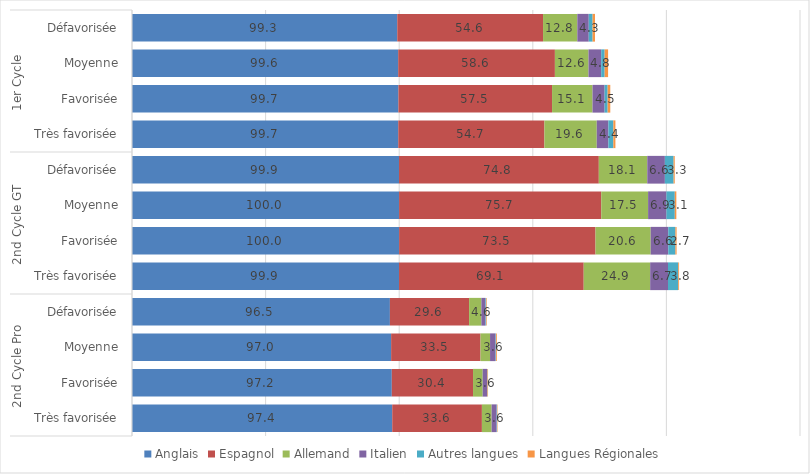
| Category | Anglais | Espagnol | Allemand | Italien | Autres langues | Langues Régionales |
|---|---|---|---|---|---|---|
| 0 | 99.273 | 54.563 | 12.825 | 4.279 | 1.441 | 0.892 |
| 1 | 99.625 | 58.649 | 12.568 | 4.756 | 1.298 | 1.283 |
| 2 | 99.703 | 57.501 | 15.146 | 4.529 | 1.132 | 0.99 |
| 3 | 99.65 | 54.69 | 19.596 | 4.354 | 1.85 | 0.778 |
| 4 | 99.934 | 74.775 | 18.129 | 6.593 | 3.264 | 0.424 |
| 5 | 99.954 | 75.666 | 17.533 | 6.854 | 3.137 | 0.579 |
| 6 | 99.966 | 73.503 | 20.64 | 6.591 | 2.67 | 0.44 |
| 7 | 99.936 | 69.119 | 24.868 | 6.67 | 3.83 | 0.322 |
| 8 | 96.522 | 29.636 | 4.595 | 1.531 | 0.268 | 0.226 |
| 9 | 96.979 | 33.452 | 3.571 | 2.036 | 0.175 | 0.319 |
| 10 | 97.232 | 30.398 | 3.613 | 1.665 | 0.124 | 0.214 |
| 11 | 97.396 | 33.558 | 3.634 | 1.876 | 0.171 | 0.163 |